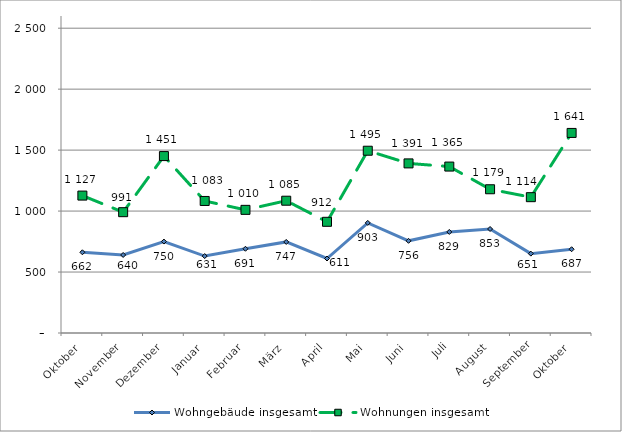
| Category | Wohngebäude insgesamt | Wohnungen insgesamt |
|---|---|---|
| Oktober | 662 | 1127 |
| November | 640 | 991 |
| Dezember | 750 | 1451 |
| Januar | 631 | 1083 |
| Februar | 691 | 1010 |
| März | 747 | 1085 |
| April | 611 | 912 |
| Mai | 903 | 1495 |
| Juni | 756 | 1391 |
| Juli | 829 | 1365 |
| August | 853 | 1179 |
| September | 651 | 1114 |
| Oktober | 687 | 1641 |